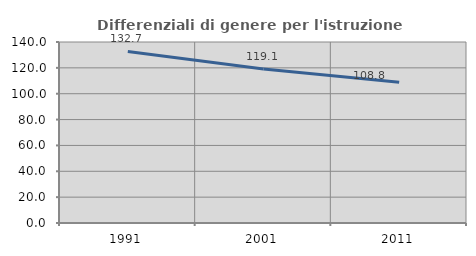
| Category | Differenziali di genere per l'istruzione superiore |
|---|---|
| 1991.0 | 132.675 |
| 2001.0 | 119.102 |
| 2011.0 | 108.793 |